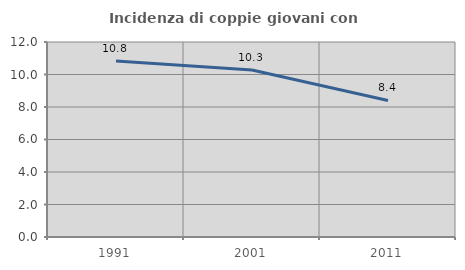
| Category | Incidenza di coppie giovani con figli |
|---|---|
| 1991.0 | 10.826 |
| 2001.0 | 10.278 |
| 2011.0 | 8.401 |